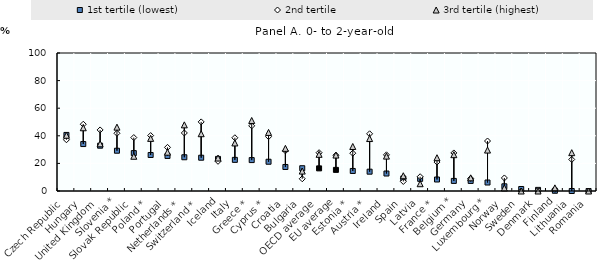
| Category | 1st tertile (lowest) | 2nd tertile | 3rd tertile (highest) |
|---|---|---|---|
| Czech Republic | 40.627 | 37.126 | 40.394 |
| Hungary | 34.023 | 48.39 | 45.813 |
| United Kingdom | 32.83 | 44.246 | 34.203 |
| Slovenia * | 29.186 | 41.833 | 46.264 |
| Slovak Republic | 27.461 | 38.722 | 25.172 |
| Poland * | 26.09 | 40.154 | 38.13 |
| Portugal | 25.393 | 31.608 | 28.114 |
| Netherlands * | 24.451 | 42.059 | 47.934 |
| Switzerland * | 24.123 | 50.073 | 41.498 |
| Iceland | 23.263 | 21.514 | 23.891 |
| Italy | 22.557 | 38.585 | 34.823 |
| Greece * | 22.4 | 47.225 | 51.105 |
| Cyprus * | 21.2 | 39.391 | 42.444 |
| Croatia | 17.407 | 29.125 | 30.904 |
| Bulgaria | 16.511 | 8.857 | 14.444 |
| OECD average | 16.4 | 27.761 | 26.582 |
| EU average | 15.303 | 25.918 | 26.043 |
| Estonia * | 14.52 | 27.39 | 32.247 |
| Austria * | 13.999 | 41.443 | 38.009 |
| Ireland | 12.663 | 26.21 | 25.294 |
| Spain | 9.086 | 6.913 | 11.06 |
| Latvia | 8.806 | 10.336 | 5.276 |
| France * | 8.328 | 20.973 | 24.115 |
| Belgium * | 7.311 | 27.581 | 26.314 |
| Germany | 7.297 | 9.114 | 9.542 |
| Luxembourg * | 6.14 | 36.224 | 29.656 |
| Norway | 3.406 | 9.452 | 2.226 |
| Sweden | 1.455 | 0 | 0 |
| Denmark | 0.81 | 0.547 | 0 |
| Finland | 0.168 | 1.189 | 2.271 |
| Lithuania | 0 | 22.866 | 27.782 |
| Romania | 0 | 0 | 0 |